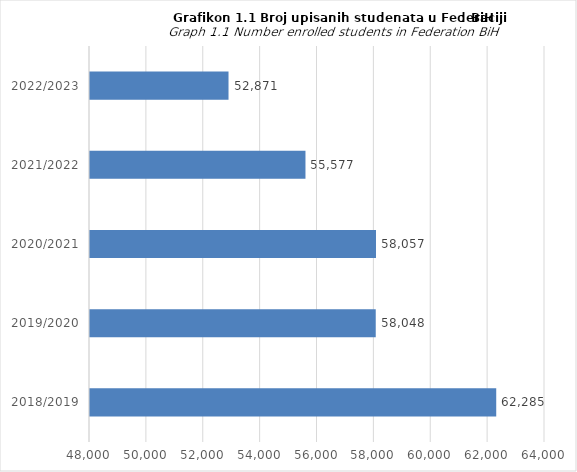
| Category | Series 0 |
|---|---|
| 2018/2019 | 62285 |
| 2019/2020 | 58048 |
| 2020/2021 | 58057 |
| 2021/2022 | 55577 |
| 2022/2023 | 52871 |